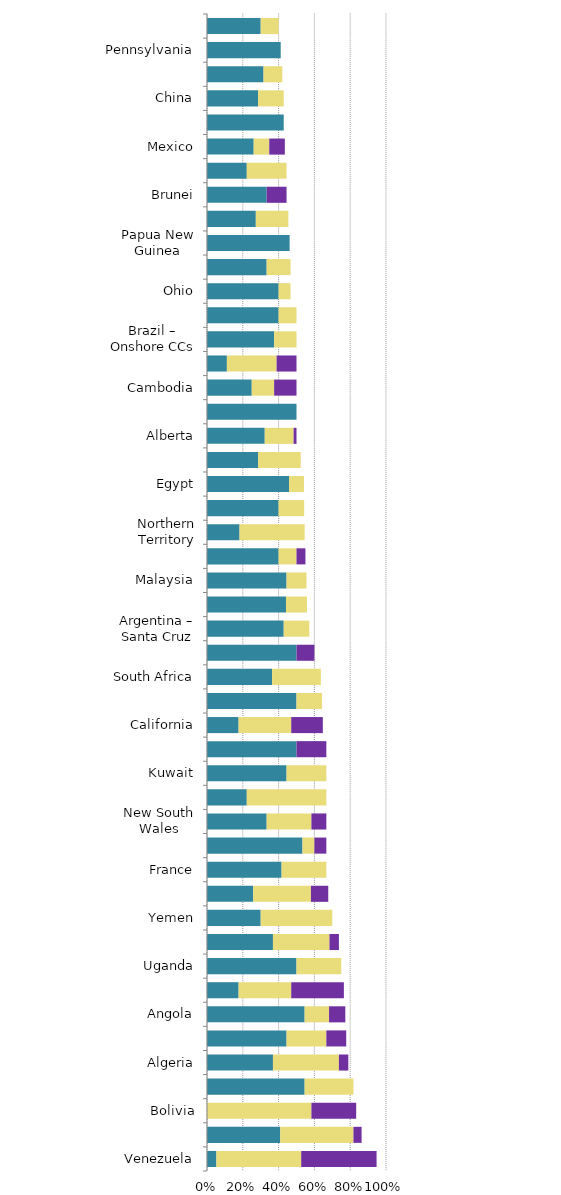
| Category |   Mild deterrent to investment |   Strong deterrent to investment |   Would not invest due to this factor |
|---|---|---|---|
| Venezuela | 0.053 | 0.474 | 0.421 |
| Indonesia | 0.409 | 0.409 | 0.045 |
| Bolivia | 0 | 0.583 | 0.25 |
| Bangladesh | 0.545 | 0.273 | 0 |
| Algeria | 0.368 | 0.368 | 0.053 |
| Libya | 0.444 | 0.222 | 0.111 |
| Angola | 0.545 | 0.136 | 0.091 |
| Ecuador | 0.176 | 0.294 | 0.294 |
| Uganda | 0.5 | 0.25 | 0 |
| Iraq | 0.368 | 0.316 | 0.053 |
| Yemen | 0.3 | 0.4 | 0 |
| Nigeria | 0.258 | 0.323 | 0.097 |
| France | 0.417 | 0.25 | 0 |
| Michigan | 0.533 | 0.067 | 0.067 |
| New South Wales | 0.333 | 0.25 | 0.083 |
| Victoria | 0.222 | 0.444 | 0 |
| Kuwait | 0.444 | 0.222 | 0 |
| Trinidad and Tobago | 0.5 | 0 | 0.167 |
| California | 0.176 | 0.294 | 0.176 |
| Kazakhstan | 0.5 | 0.143 | 0 |
| South Africa | 0.364 | 0.273 | 0 |
| Rep. of Congo (Brazzaville) | 0.5 | 0 | 0.1 |
| Argentina – Santa Cruz | 0.429 | 0.143 | 0 |
| Colorado | 0.441 | 0.118 | 0 |
| Malaysia | 0.444 | 0.111 | 0 |
| Vietnam | 0.4 | 0.1 | 0.05 |
| Northern Territory | 0.182 | 0.364 | 0 |
| British Columbia | 0.4 | 0.143 | 0 |
| Egypt | 0.458 | 0.083 | 0 |
| Gabon | 0.286 | 0.238 | 0 |
| Alberta | 0.323 | 0.161 | 0.016 |
| Illinois | 0.5 | 0 | 0 |
| Cambodia | 0.25 | 0.125 | 0.125 |
| India | 0.111 | 0.278 | 0.111 |
| Brazil – Onshore CCs | 0.375 | 0.125 | 0 |
| Brazil – Offshore CCs | 0.4 | 0.1 | 0 |
| Ohio | 0.4 | 0.067 | 0 |
| Kenya | 0.333 | 0.133 | 0 |
| Papua New Guinea | 0.462 | 0 | 0 |
| Brazil – Offshore presalt PSCs | 0.273 | 0.182 | 0 |
| Brunei | 0.333 | 0 | 0.111 |
| Tanzania | 0.222 | 0.222 | 0 |
| Mexico | 0.261 | 0.087 | 0.087 |
| Hungary | 0.429 | 0 | 0 |
| China | 0.286 | 0.143 | 0 |
| Equatorial Guinea | 0.316 | 0.105 | 0 |
| Pennsylvania | 0.412 | 0 | 0 |
| Spain – Onshore | 0.3 | 0.1 | 0 |